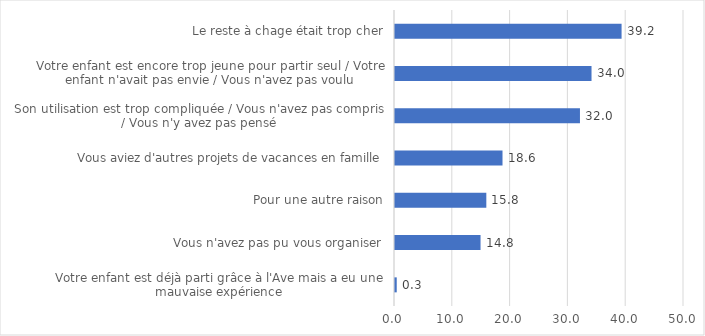
| Category | Series 0 |
|---|---|
| Votre enfant est déjà parti grâce à l'Ave mais a eu une mauvaise expérience | 0.3 |
| Vous n'avez pas pu vous organiser | 14.8 |
| Pour une autre raison | 15.8 |
| Vous aviez d'autres projets de vacances en famille | 18.6 |
| Son utilisation est trop compliquée / Vous n'avez pas compris / Vous n'y avez pas pensé | 32 |
| Votre enfant est encore trop jeune pour partir seul / Votre enfant n'avait pas envie / Vous n'avez pas voulu | 34 |
| Le reste à chage était trop cher | 39.2 |